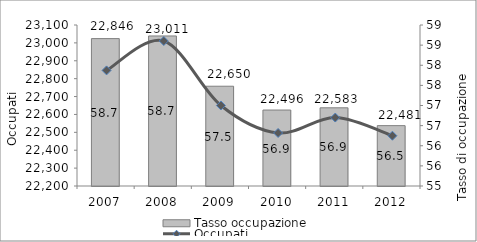
| Category | Tasso occupazione |
|---|---|
| 0 | 58.662 |
| 1 | 58.728 |
| 2 | 57.479 |
| 3 | 56.887 |
| 4 | 56.943 |
| 5 | 56.5 |